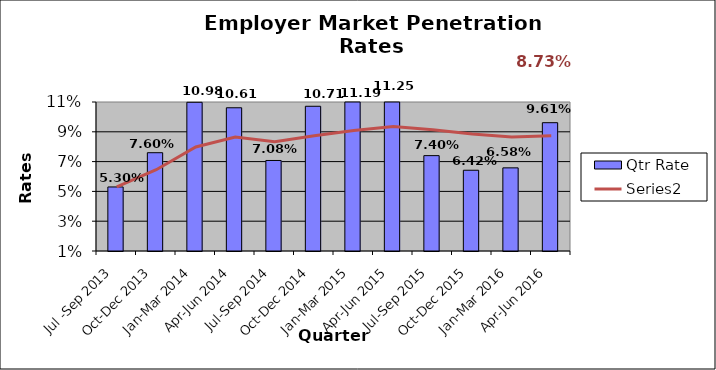
| Category | Qtr Rate |
|---|---|
| Jul -Sep 2013 | 0.053 |
| Oct-Dec 2013 | 0.076 |
| Jan-Mar 2014 | 0.11 |
| Apr-Jun 2014 | 0.106 |
| Jul-Sep 2014 | 0.071 |
| Oct-Dec 2014 | 0.107 |
| Jan-Mar 2015 | 0.112 |
| Apr-Jun 2015 | 0.112 |
| Jul-Sep 2015 | 0.074 |
| Oct-Dec 2015 | 0.064 |
| Jan-Mar 2016 | 0.066 |
| Apr-Jun 2016 | 0.096 |